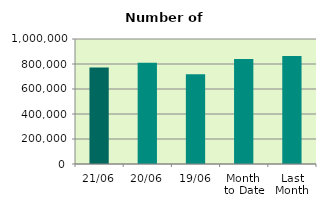
| Category | Series 0 |
|---|---|
| 21/06 | 771282 |
| 20/06 | 810200 |
| 19/06 | 717440 |
| Month 
to Date | 840225.2 |
| Last
Month | 864947.091 |